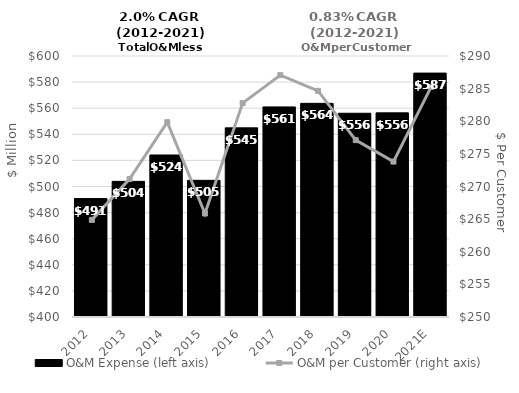
| Category | O&M Expense (left axis) |
|---|---|
| 2012 | 490.765 |
| 2013 | 503.939 |
| 2014 | 524.146 |
| 2015 | 504.72 |
| 2016 | 544.933 |
| 2017 | 560.977 |
| 2018 | 563.717 |
| 2019 | 556.124 |
| 2020 | 556.418 |
| 2021E | 586.894 |